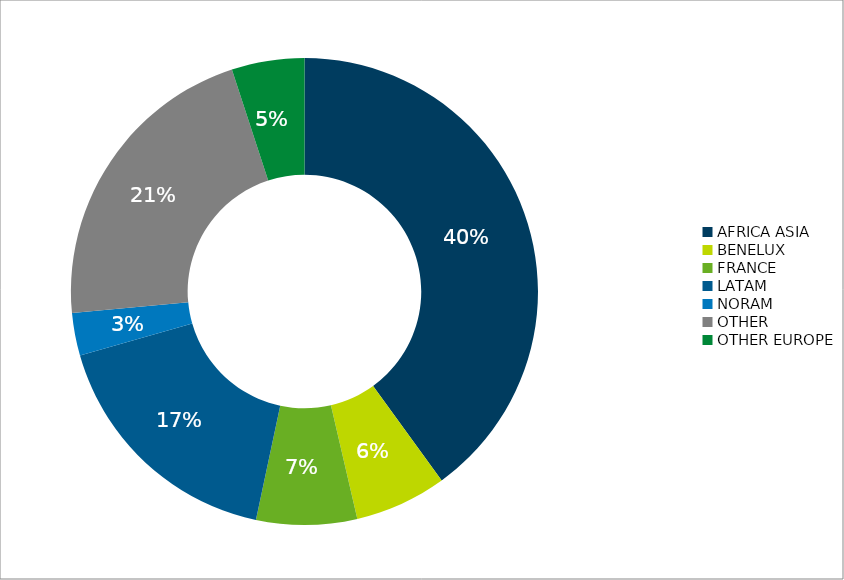
| Category | Total |
|---|---|
| AFRICA ASIA | 42856.207 |
| BENELUX | 6811.197 |
| FRANCE | 7467.649 |
| LATAM | 18465.017 |
| NORAM | 3161.7 |
| OTHER | 22970.279 |
| OTHER EUROPE | 5391.028 |